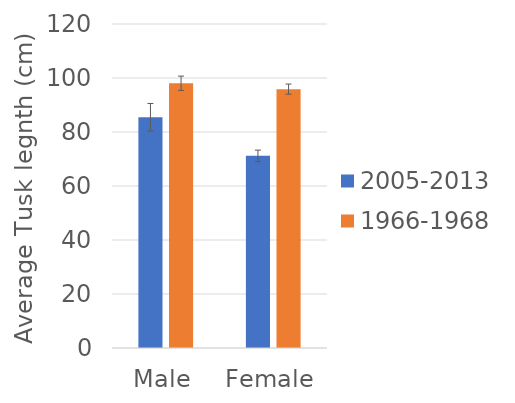
| Category | 2005-2013 | 1966-1968 |
|---|---|---|
| Male | 85.471 | 98.05 |
| Female | 71.162 | 95.878 |